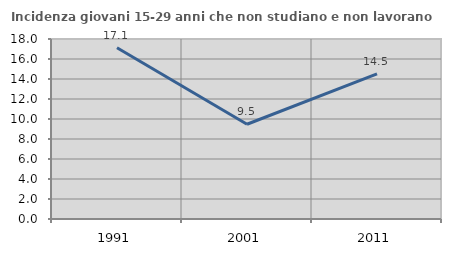
| Category | Incidenza giovani 15-29 anni che non studiano e non lavorano  |
|---|---|
| 1991.0 | 17.133 |
| 2001.0 | 9.476 |
| 2011.0 | 14.506 |